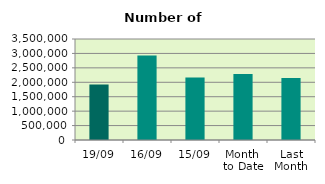
| Category | Series 0 |
|---|---|
| 19/09 | 1926248 |
| 16/09 | 2927124 |
| 15/09 | 2162792 |
| Month 
to Date | 2288386.462 |
| Last
Month | 2149140 |